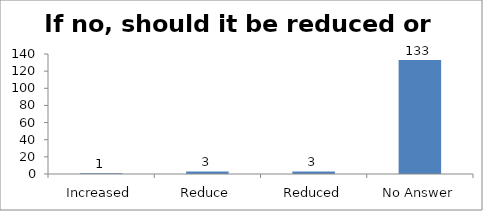
| Category | If no, should it be reduced or increased |
|---|---|
| Increased | 1 |
| Reduce | 3 |
| Reduced | 3 |
| No Answer | 133 |